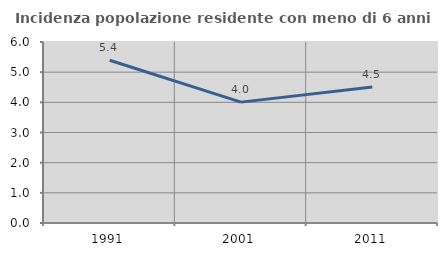
| Category | Incidenza popolazione residente con meno di 6 anni |
|---|---|
| 1991.0 | 5.394 |
| 2001.0 | 4.007 |
| 2011.0 | 4.511 |